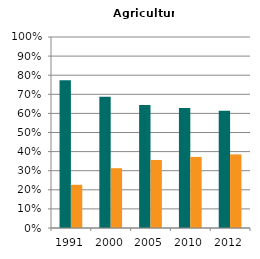
| Category | Male | Female |
|---|---|---|
| 1991.0 | 0.774 | 0.226 |
| 2000.0 | 0.687 | 0.313 |
| 2005.0 | 0.644 | 0.356 |
| 2010.0 | 0.628 | 0.372 |
| 2012.0 | 0.614 | 0.386 |